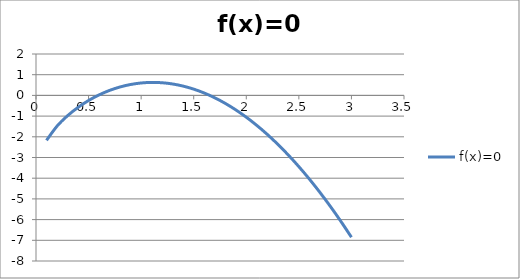
| Category | f(x)=0 |
|---|---|
| 0.1 | -2.171 |
| 0.2 | -1.485 |
| 0.30000000000000004 | -0.982 |
| 0.4 | -0.578 |
| 0.5 | -0.247 |
| 0.6 | 0.025 |
| 0.7 | 0.242 |
| 0.7999999999999999 | 0.408 |
| 0.8999999999999999 | 0.527 |
| 0.9999999999999999 | 0.6 |
| 1.0999999999999999 | 0.628 |
| 1.2 | 0.611 |
| 1.3 | 0.551 |
| 1.4000000000000001 | 0.448 |
| 1.5000000000000002 | 0.303 |
| 1.6000000000000003 | 0.115 |
| 1.7000000000000004 | -0.115 |
| 1.8000000000000005 | -0.386 |
| 1.9000000000000006 | -0.699 |
| 2.0000000000000004 | -1.053 |
| 2.1000000000000005 | -1.449 |
| 2.2000000000000006 | -1.886 |
| 2.3000000000000007 | -2.364 |
| 2.400000000000001 | -2.882 |
| 2.500000000000001 | -3.442 |
| 2.600000000000001 | -4.042 |
| 2.700000000000001 | -4.683 |
| 2.800000000000001 | -5.365 |
| 2.9000000000000012 | -6.088 |
| 3.0000000000000013 | -6.851 |